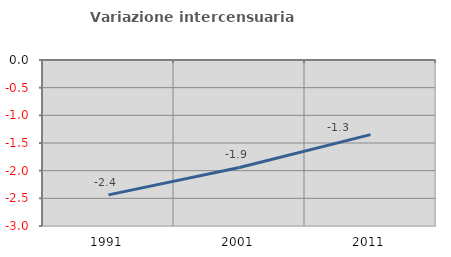
| Category | Variazione intercensuaria annua |
|---|---|
| 1991.0 | -2.438 |
| 2001.0 | -1.942 |
| 2011.0 | -1.348 |